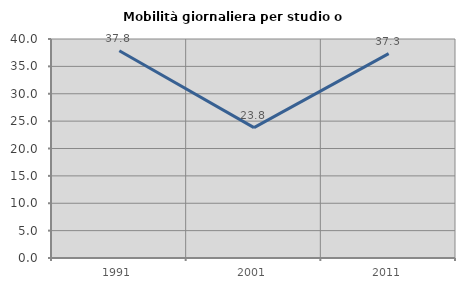
| Category | Mobilità giornaliera per studio o lavoro |
|---|---|
| 1991.0 | 37.843 |
| 2001.0 | 23.81 |
| 2011.0 | 37.319 |